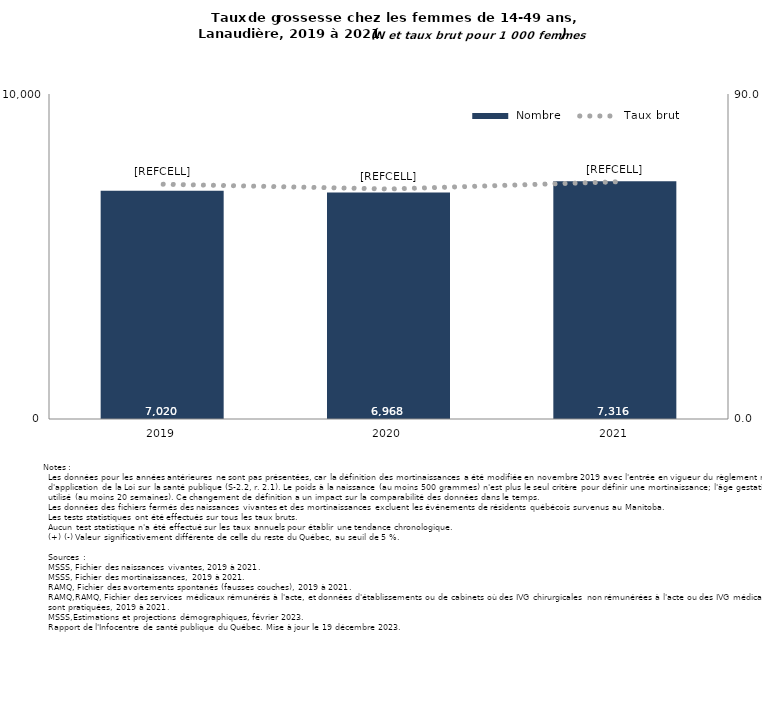
| Category |  Nombre |
|---|---|
| 2019.0 | 7020 |
| 2020.0 | 6968 |
| 2021.0 | 7316 |